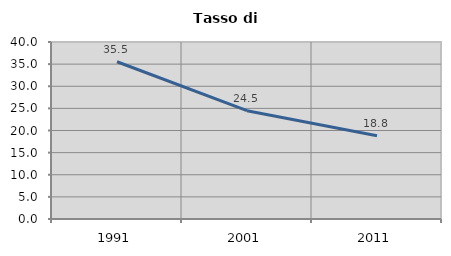
| Category | Tasso di disoccupazione   |
|---|---|
| 1991.0 | 35.54 |
| 2001.0 | 24.477 |
| 2011.0 | 18.828 |